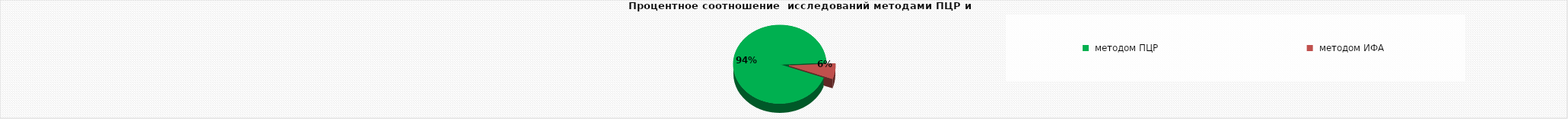
| Category | сыворотка | 1850 |
|---|---|---|
|  методом ПЦР | 1850 |  |
|  методом ИФА | 125 |  |